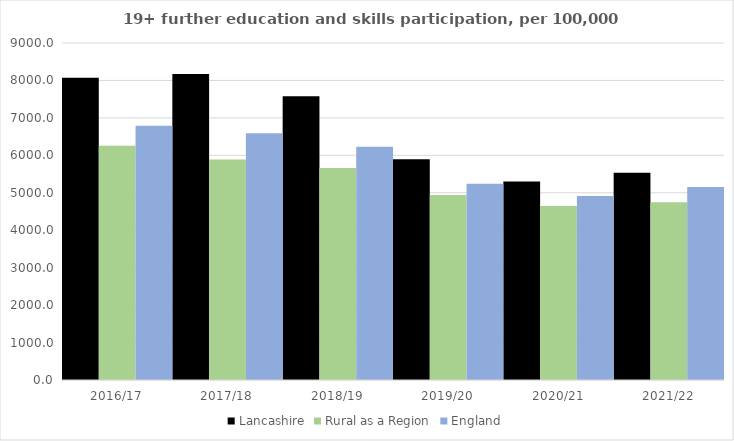
| Category | Lancashire | Rural as a Region | England |
|---|---|---|---|
| 2016/17 | 8069.369 | 6253.401 | 6788 |
| 2017/18 | 8174.975 | 5892.029 | 6588 |
| 2018/19 | 7576.234 | 5661.873 | 6227 |
| 2019/20 | 5893.806 | 4943.801 | 5244 |
| 2020/21 | 5301.601 | 4646.727 | 4913 |
| 2021/22 | 5532.627 | 4747.049 | 5151 |